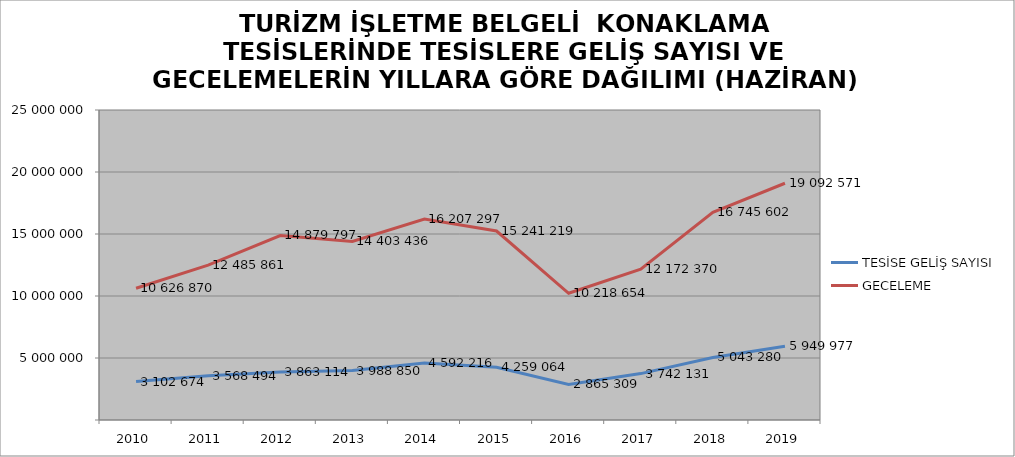
| Category | TESİSE GELİŞ SAYISI | GECELEME |
|---|---|---|
| 2010 | 3102674 | 10626870 |
| 2011 | 3568494 | 12485861 |
| 2012 | 3863114 | 14879797 |
| 2013 | 3988850 | 14403436 |
| 2014 | 4592216 | 16207297 |
| 2015 | 4259064 | 15241219 |
| 2016 | 2865309 | 10218654 |
| 2017 | 3742131 | 12172370 |
| 2018 | 5043280 | 16745602 |
| 2019 | 5949977 | 19092571 |